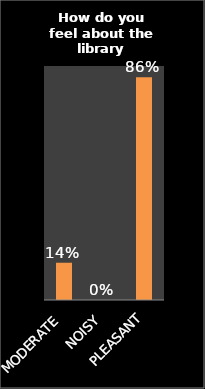
| Category | Series 0 |
|---|---|
| MODERATE | 0.143 |
| NOISY | 0 |
| PLEASANT | 0.857 |